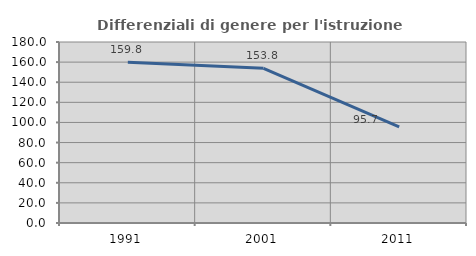
| Category | Differenziali di genere per l'istruzione superiore |
|---|---|
| 1991.0 | 159.764 |
| 2001.0 | 153.784 |
| 2011.0 | 95.656 |